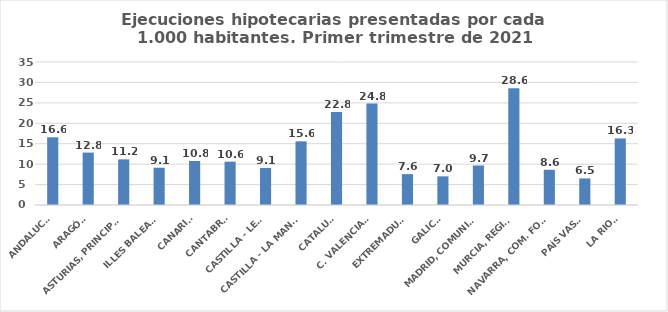
| Category | 616 |
|---|---|
| ANDALUCÍA | 16.572 |
| ARAGÓN | 12.827 |
| ASTURIAS, PRINCIPADO | 11.171 |
| ILLES BALEARS | 9.127 |
| CANARIAS | 10.777 |
| CANTABRIA | 10.611 |
| CASTILLA - LEÓN | 9.071 |
| CASTILLA - LA MANCHA | 15.578 |
| CATALUÑA | 22.78 |
| C. VALENCIANA | 24.815 |
| EXTREMADURA | 7.556 |
| GALICIA | 7.015 |
| MADRID, COMUNIDAD | 9.666 |
| MURCIA, REGIÓN | 28.591 |
| NAVARRA, COM. FORAL | 8.623 |
| PAÍS VASCO | 6.508 |
| LA RIOJA | 16.29 |